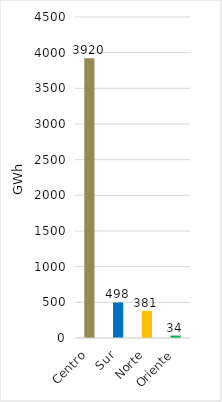
| Category | Series 0 |
|---|---|
| Centro | 3920.423 |
| Sur | 498.253 |
| Norte | 380.935 |
| Oriente | 34.096 |